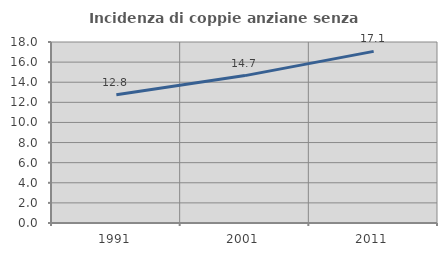
| Category | Incidenza di coppie anziane senza figli  |
|---|---|
| 1991.0 | 12.763 |
| 2001.0 | 14.658 |
| 2011.0 | 17.069 |